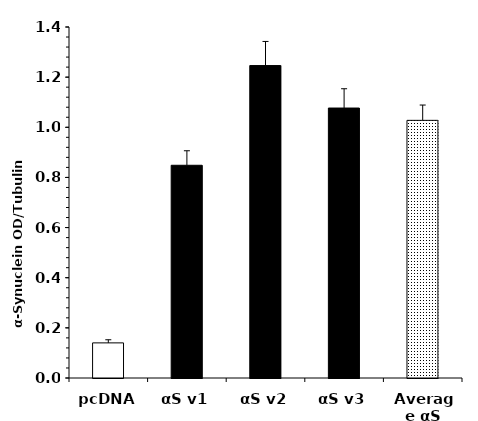
| Category | Series 0 |
|---|---|
| pcDNA | 0.14 |
| αS v1 | 0.848 |
| αS v2 | 1.246 |
| αS v3 | 1.077 |
| Average αS | 1.028 |